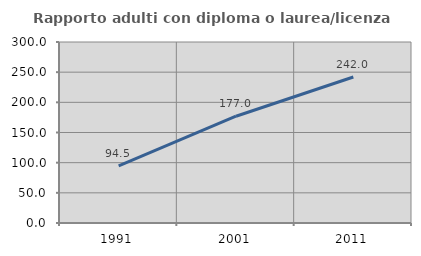
| Category | Rapporto adulti con diploma o laurea/licenza media  |
|---|---|
| 1991.0 | 94.514 |
| 2001.0 | 176.982 |
| 2011.0 | 241.954 |